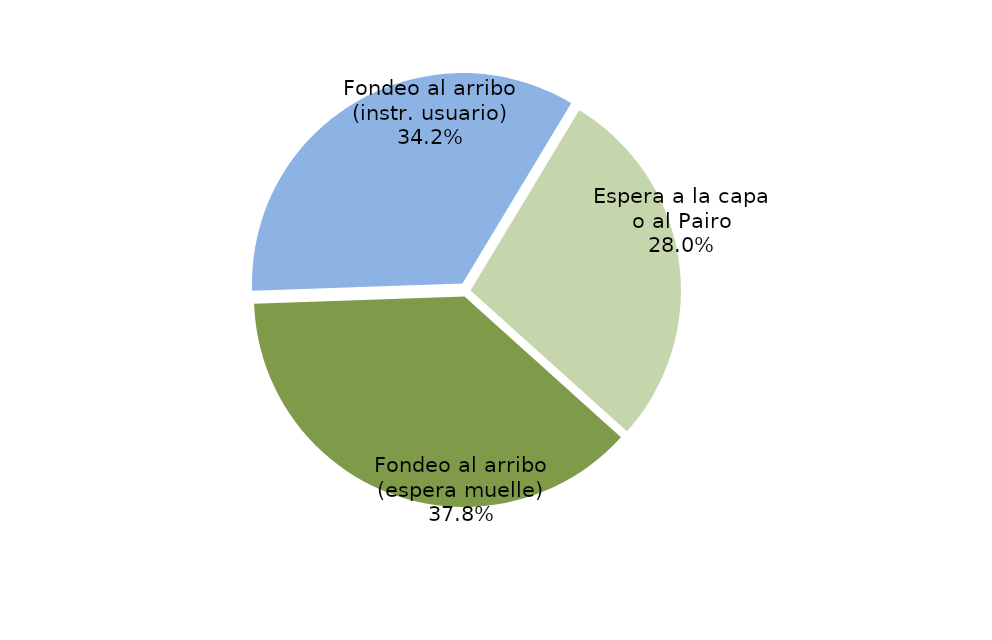
| Category | Series 0 |
|---|---|
| Fondeo al arribo (espera muelle) | 10924.583 |
| Fondeo al arribo (instr. usuario) | 9882.867 |
| Espera a la capa o al Pairo | 8105.383 |